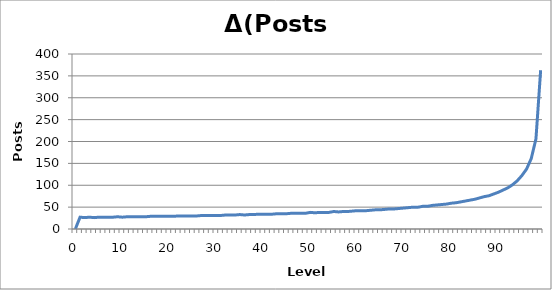
| Category | Δ(Posts Required) |
|---|---|
| 0.0 | 0 |
| 1.0 | 27 |
| 2.0 | 26 |
| 3.0 | 27 |
| 4.0 | 26 |
| 5.0 | 27 |
| 6.0 | 27 |
| 7.0 | 27 |
| 8.0 | 27 |
| 9.0 | 28 |
| 10.0 | 27 |
| 11.0 | 28 |
| 12.0 | 28 |
| 13.0 | 28 |
| 14.0 | 28 |
| 15.0 | 28 |
| 16.0 | 29 |
| 17.0 | 29 |
| 18.0 | 29 |
| 19.0 | 29 |
| 20.0 | 29 |
| 21.0 | 29 |
| 22.0 | 30 |
| 23.0 | 30 |
| 24.0 | 30 |
| 25.0 | 30 |
| 26.0 | 30 |
| 27.0 | 31 |
| 28.0 | 31 |
| 29.0 | 31 |
| 30.0 | 31 |
| 31.0 | 31 |
| 32.0 | 32 |
| 33.0 | 32 |
| 34.0 | 32 |
| 35.0 | 33 |
| 36.0 | 32 |
| 37.0 | 33 |
| 38.0 | 33 |
| 39.0 | 34 |
| 40.0 | 34 |
| 41.0 | 34 |
| 42.0 | 34 |
| 43.0 | 35 |
| 44.0 | 35 |
| 45.0 | 35 |
| 46.0 | 36 |
| 47.0 | 36 |
| 48.0 | 36 |
| 49.0 | 36 |
| 50.0 | 38 |
| 51.0 | 37 |
| 52.0 | 38 |
| 53.0 | 38 |
| 54.0 | 38 |
| 55.0 | 40 |
| 56.0 | 39 |
| 57.0 | 40 |
| 58.0 | 40 |
| 59.0 | 41 |
| 60.0 | 42 |
| 61.0 | 42 |
| 62.0 | 42 |
| 63.0 | 43 |
| 64.0 | 44 |
| 65.0 | 44 |
| 66.0 | 45 |
| 67.0 | 46 |
| 68.0 | 46 |
| 69.0 | 47 |
| 70.0 | 48 |
| 71.0 | 49 |
| 72.0 | 50 |
| 73.0 | 50 |
| 74.0 | 52 |
| 75.0 | 52 |
| 76.0 | 54 |
| 77.0 | 55 |
| 78.0 | 56 |
| 79.0 | 57 |
| 80.0 | 59 |
| 81.0 | 60 |
| 82.0 | 62 |
| 83.0 | 64 |
| 84.0 | 66 |
| 85.0 | 68 |
| 86.0 | 71 |
| 87.0 | 74 |
| 88.0 | 76 |
| 89.0 | 80 |
| 90.0 | 84 |
| 91.0 | 89 |
| 92.0 | 94 |
| 93.0 | 101 |
| 94.0 | 110 |
| 95.0 | 122 |
| 96.0 | 137 |
| 97.0 | 161 |
| 98.0 | 206 |
| 99.0 | 363 |